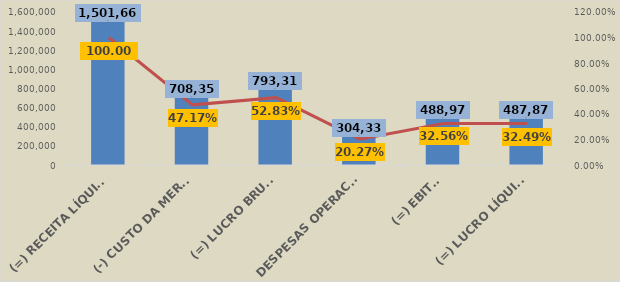
| Category | Em R$ 1 |
|---|---|
| (=) RECEITA LÍQUIDA DE VENDAS | 1501667.546 |
| (-) CUSTO DA MERCADORIA VENDIDA (CMV) | 708352.89 |
| (=) LUCRO BRUTO | 793314.656 |
| DESPESAS OPERACIONAIS | 304337.205 |
| (=) EBITDA | 488977.451 |
| (=) LUCRO LÍQUIDO | 487878.411 |